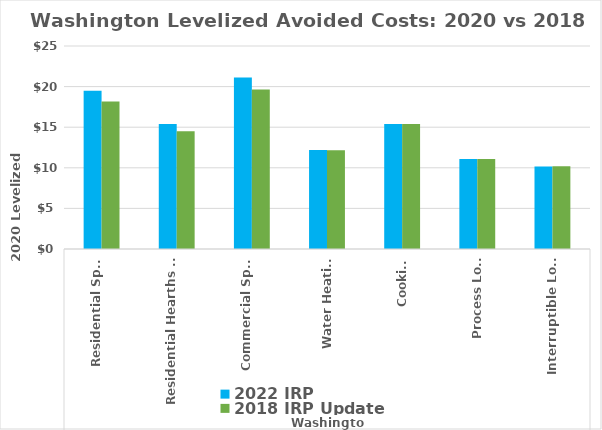
| Category | 2022 IRP | 2018 IRP Update |
|---|---|---|
| 0 | 19.492 | 18.162 |
| 1 | 15.384 | 14.516 |
| 2 | 21.118 | 19.628 |
| 3 | 12.177 | 12.169 |
| 4 | 15.404 | 15.404 |
| 5 | 11.071 | 11.082 |
| 6 | 10.152 | 10.197 |